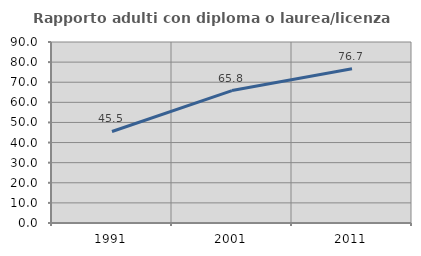
| Category | Rapporto adulti con diploma o laurea/licenza media  |
|---|---|
| 1991.0 | 45.517 |
| 2001.0 | 65.848 |
| 2011.0 | 76.744 |